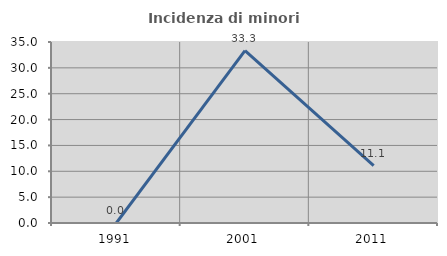
| Category | Incidenza di minori stranieri |
|---|---|
| 1991.0 | 0 |
| 2001.0 | 33.333 |
| 2011.0 | 11.111 |